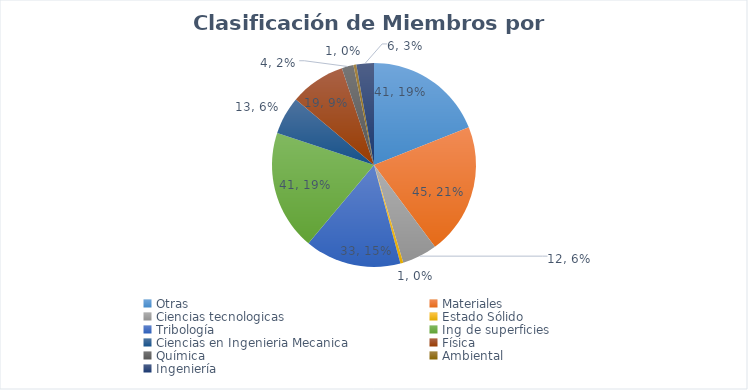
| Category | Series 0 |
|---|---|
| Otras | 41 |
| Materiales | 45 |
| Ciencias tecnologicas  | 12 |
| Estado Sólido | 1 |
| Tribología | 33 |
| Ing de superficies | 41 |
| Ciencias en Ingenieria Mecanica | 13 |
| Física | 19 |
| Química | 4 |
| Ambiental | 1 |
| Ingeniería | 6 |